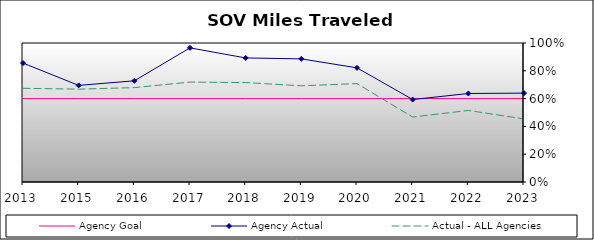
| Category | Agency Goal | Agency Actual | Actual - ALL Agencies |
|---|---|---|---|
| 2013.0 | 0.6 | 0.856 | 0.674 |
| 2015.0 | 0.6 | 0.695 | 0.668 |
| 2016.0 | 0.6 | 0.728 | 0.679 |
| 2017.0 | 0.6 | 0.965 | 0.719 |
| 2018.0 | 0.6 | 0.892 | 0.715 |
| 2019.0 | 0.6 | 0.886 | 0.692 |
| 2020.0 | 0.6 | 0.821 | 0.708 |
| 2021.0 | 0.6 | 0.593 | 0.467 |
| 2022.0 | 0.6 | 0.637 | 0.515 |
| 2023.0 | 0.6 | 0.64 | 0.454 |